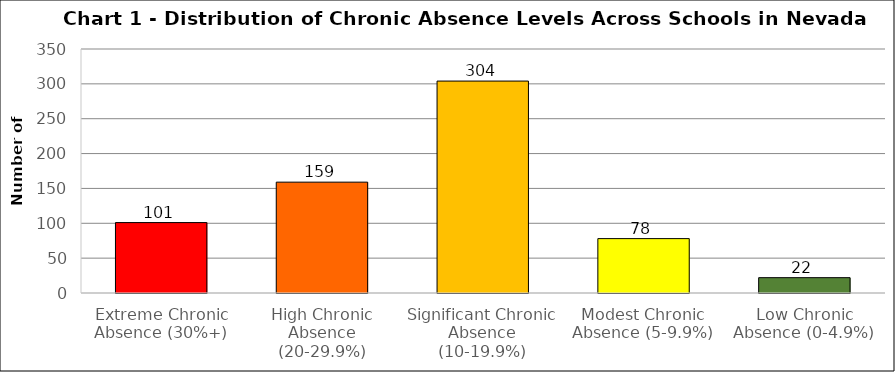
| Category | Series 0 |
|---|---|
| Extreme Chronic Absence (30%+) | 101 |
| High Chronic Absence (20-29.9%) | 159 |
| Significant Chronic Absence (10-19.9%) | 304 |
| Modest Chronic Absence (5-9.9%) | 78 |
| Low Chronic Absence (0-4.9%) | 22 |